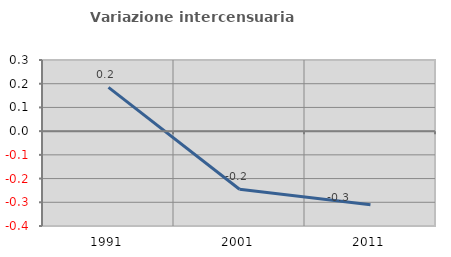
| Category | Variazione intercensuaria annua |
|---|---|
| 1991.0 | 0.185 |
| 2001.0 | -0.245 |
| 2011.0 | -0.31 |